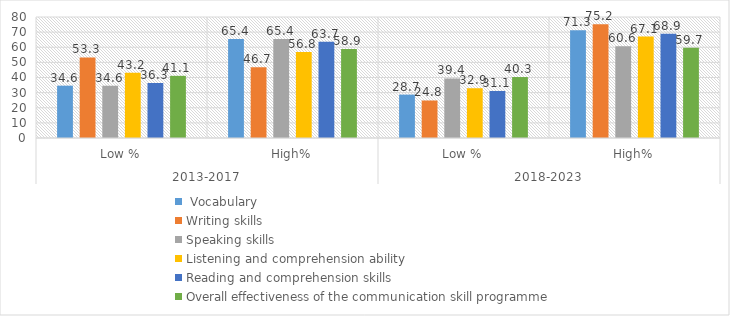
| Category |  Vocabulary | Writing skills | Speaking skills | Listening and comprehension ability | Reading and comprehension skills | Overall effectiveness of the communication skill programme |
|---|---|---|---|---|---|---|
| 0 | 34.6 | 53.3 | 34.6 | 43.2 | 36.3 | 41.1 |
| 1 | 65.4 | 46.7 | 65.4 | 56.8 | 63.7 | 58.9 |
| 2 | 28.7 | 24.8 | 39.4 | 32.9 | 31.1 | 40.3 |
| 3 | 71.3 | 75.2 | 60.6 | 67.1 | 68.9 | 59.7 |